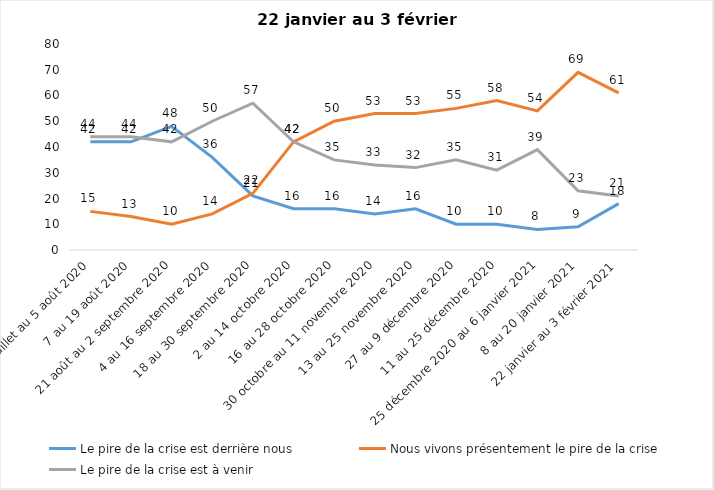
| Category | Le pire de la crise est derrière nous | Nous vivons présentement le pire de la crise | Le pire de la crise est à venir |
|---|---|---|---|
| 24 juillet au 5 août 2020 | 42 | 15 | 44 |
| 7 au 19 août 2020 | 42 | 13 | 44 |
| 21 août au 2 septembre 2020 | 48 | 10 | 42 |
| 4 au 16 septembre 2020 | 36 | 14 | 50 |
| 18 au 30 septembre 2020 | 21 | 22 | 57 |
| 2 au 14 octobre 2020 | 16 | 42 | 42 |
| 16 au 28 octobre 2020 | 16 | 50 | 35 |
| 30 octobre au 11 novembre 2020 | 14 | 53 | 33 |
| 13 au 25 novembre 2020 | 16 | 53 | 32 |
| 27 au 9 décembre 2020 | 10 | 55 | 35 |
| 11 au 25 décembre 2020 | 10 | 58 | 31 |
| 25 décembre 2020 au 6 janvier 2021 | 8 | 54 | 39 |
| 8 au 20 janvier 2021 | 9 | 69 | 23 |
| 22 janvier au 3 février 2021 | 18 | 61 | 21 |